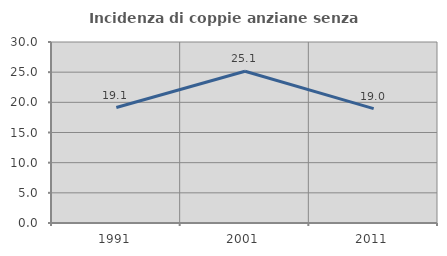
| Category | Incidenza di coppie anziane senza figli  |
|---|---|
| 1991.0 | 19.143 |
| 2001.0 | 25.15 |
| 2011.0 | 18.966 |